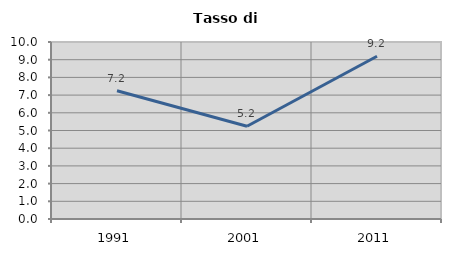
| Category | Tasso di disoccupazione   |
|---|---|
| 1991.0 | 7.243 |
| 2001.0 | 5.237 |
| 2011.0 | 9.197 |